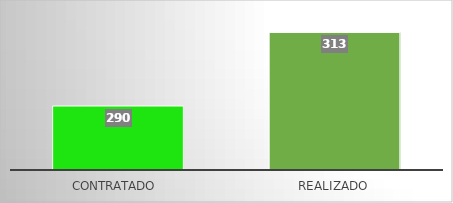
| Category | Series 0 |
|---|---|
| Contratado  | 290 |
| Realizado | 313 |